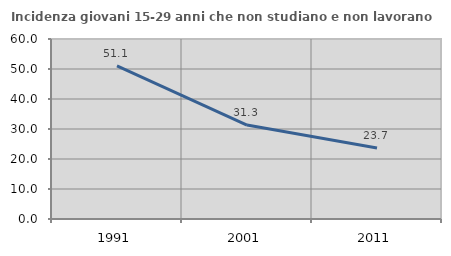
| Category | Incidenza giovani 15-29 anni che non studiano e non lavorano  |
|---|---|
| 1991.0 | 51.053 |
| 2001.0 | 31.323 |
| 2011.0 | 23.698 |